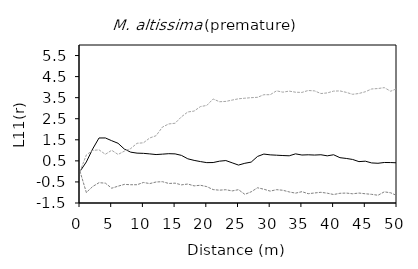
| Category | E11- | E11+ | Expect |
|---|---|---|---|
| 0.0 | 0 | 0 | 0 |
| 1.0 | 0.448 | -1 | 0.781 |
| 2.0 | 1.066 | -0.718 | 0.997 |
| 3.0 | 1.587 | -0.536 | 1.023 |
| 4.0 | 1.587 | -0.558 | 0.812 |
| 5.0 | 1.457 | -0.798 | 1.003 |
| 6.0 | 1.335 | -0.702 | 0.805 |
| 7.0 | 1.059 | -0.616 | 0.963 |
| 8.0 | 0.913 | -0.632 | 1.084 |
| 9.0 | 0.867 | -0.633 | 1.335 |
| 10.0 | 0.857 | -0.526 | 1.356 |
| 11.0 | 0.831 | -0.577 | 1.586 |
| 12.0 | 0.799 | -0.503 | 1.694 |
| 13.0 | 0.819 | -0.488 | 2.104 |
| 14.0 | 0.841 | -0.573 | 2.252 |
| 15.0 | 0.831 | -0.558 | 2.286 |
| 16.0 | 0.76 | -0.638 | 2.592 |
| 17.0 | 0.599 | -0.599 | 2.821 |
| 18.0 | 0.523 | -0.687 | 2.864 |
| 19.0 | 0.466 | -0.658 | 3.077 |
| 20.0 | 0.416 | -0.722 | 3.132 |
| 21.0 | 0.42 | -0.864 | 3.438 |
| 22.0 | 0.485 | -0.891 | 3.306 |
| 23.0 | 0.515 | -0.869 | 3.323 |
| 24.0 | 0.407 | -0.926 | 3.385 |
| 25.0 | 0.3 | -0.868 | 3.447 |
| 26.0 | 0.385 | -1.09 | 3.474 |
| 27.0 | 0.442 | -0.969 | 3.499 |
| 28.0 | 0.71 | -0.777 | 3.517 |
| 29.0 | 0.822 | -0.846 | 3.64 |
| 30.0 | 0.785 | -0.936 | 3.641 |
| 31.0 | 0.769 | -0.867 | 3.824 |
| 32.0 | 0.753 | -0.895 | 3.761 |
| 33.0 | 0.741 | -0.975 | 3.812 |
| 34.0 | 0.833 | -1.032 | 3.759 |
| 35.0 | 0.778 | -0.963 | 3.749 |
| 36.0 | 0.789 | -1.058 | 3.841 |
| 37.0 | 0.776 | -1.024 | 3.821 |
| 38.0 | 0.79 | -0.992 | 3.696 |
| 39.0 | 0.739 | -1.034 | 3.726 |
| 40.0 | 0.79 | -1.098 | 3.811 |
| 41.0 | 0.651 | -1.039 | 3.82 |
| 42.0 | 0.615 | -1.029 | 3.751 |
| 43.0 | 0.567 | -1.062 | 3.66 |
| 44.0 | 0.465 | -1.028 | 3.699 |
| 45.0 | 0.485 | -1.062 | 3.781 |
| 46.0 | 0.402 | -1.089 | 3.912 |
| 47.0 | 0.386 | -1.133 | 3.934 |
| 48.0 | 0.423 | -0.97 | 3.976 |
| 49.0 | 0.42 | -1.016 | 3.805 |
| 50.0 | 0.408 | -1.149 | 3.931 |